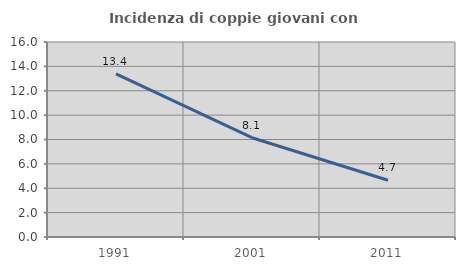
| Category | Incidenza di coppie giovani con figli |
|---|---|
| 1991.0 | 13.386 |
| 2001.0 | 8.148 |
| 2011.0 | 4.659 |